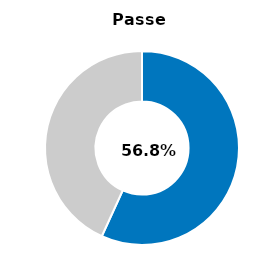
| Category | Series 0 |
|---|---|
| Passed | 0.568 |
| Other | 0.432 |